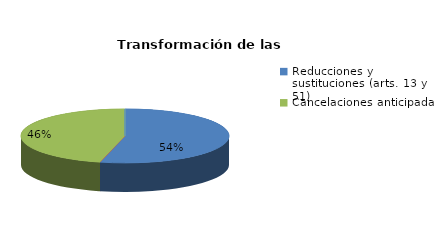
| Category | Series 0 |
|---|---|
| Reducciones y sustituciones (arts. 13 y 51) | 7 |
| Por quebrantamiento (art. 50.2) | 0 |
| Cancelaciones anticipadas | 6 |
| Traslado a Centros Penitenciarios | 0 |
| Conversión internamientos en cerrados (art. 51.2) | 0 |